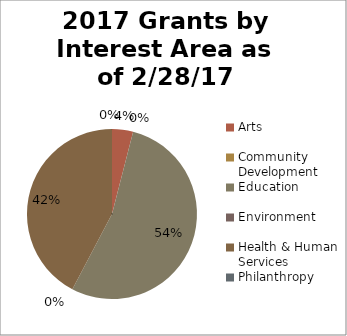
| Category | Series 0 | Series 1 |
|---|---|---|
| Arts | 11150 | 0.04 |
| Community Development | 0 | 0 |
| Education | 149669.5 | 0.537 |
| Environment | 0 | 0 |
| Health & Human Services | 117799 | 0.423 |
| Philanthropy | 0 | 0 |